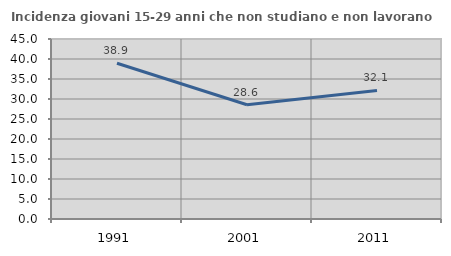
| Category | Incidenza giovani 15-29 anni che non studiano e non lavorano  |
|---|---|
| 1991.0 | 38.928 |
| 2001.0 | 28.571 |
| 2011.0 | 32.143 |